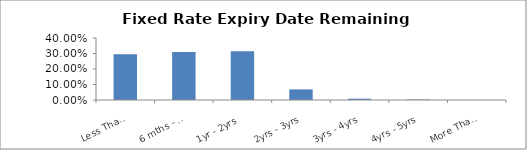
| Category | Series 0 |
|---|---|
| Less Than 6 mths | 0.295 |
| 6 mths - 1yr | 0.31 |
| 1yr - 2yrs | 0.315 |
| 2yrs - 3yrs | 0.068 |
| 3yrs - 4yrs | 0.008 |
| 4yrs - 5yrs | 0.003 |
| More Than 5 yrs | 0 |